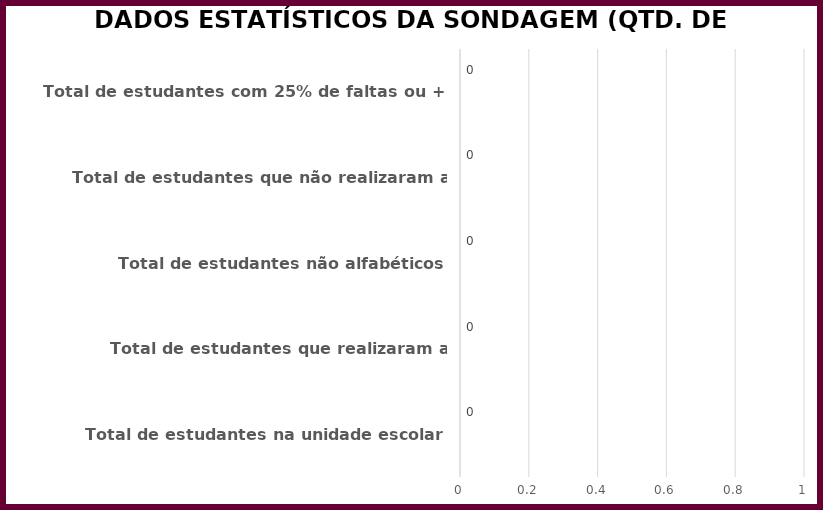
| Category | Series 0 | Series 1 | Series 2 | Series 3 |
|---|---|---|---|---|
| Total de estudantes na unidade escolar |  |  |  | 0 |
| Total de estudantes que realizaram a sondagem |  |  |  | 0 |
| Total de estudantes não alfabéticos |  |  |  | 0 |
| Total de estudantes que não realizaram a sondagem  |  |  |  | 0 |
| Total de estudantes com 25% de faltas ou + |  |  |  | 0 |